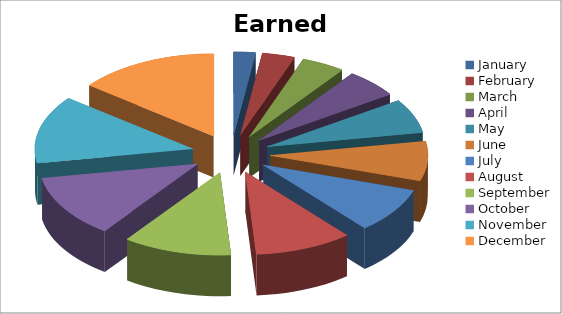
| Category | Earned | Spent | Revenue |
|---|---|---|---|
| January | 2000 | 2000 | 0 |
| February | 3000 | 2000 | 1000 |
| March | 4000 | 2000 | 2000 |
| April | 5000 | 2000 | 3000 |
| May | 6000 | 2000 | 4000 |
| June | 7000 | 2000 | 5000 |
| July | 8000 | 2000 | 6000 |
| August | 9000 | 2000 | 7000 |
| September | 10000 | 2000 | 8000 |
| October | 11000 | 2000 | 9000 |
| November | 12000 | 2000 | 10000 |
| December | 13000 | 2000 | 11000 |